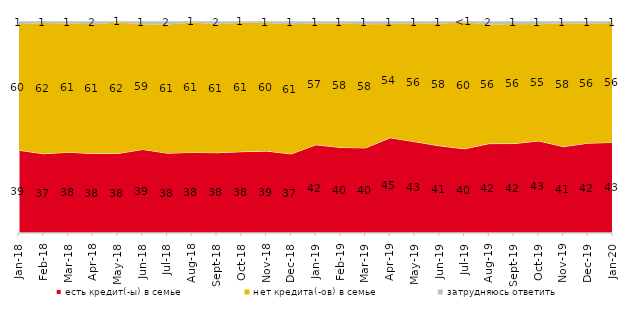
| Category | есть кредит(-ы) в семье | нет кредита(-ов) в семье | затрудняюсь ответить |
|---|---|---|---|
| 2018-01-01 | 39.05 | 59.5 | 1.45 |
| 2018-02-01 | 37.4 | 61.8 | 0.8 |
| 2018-03-01 | 38.15 | 60.8 | 1.05 |
| 2018-04-01 | 37.5 | 61 | 1.5 |
| 2018-05-01 | 37.55 | 61.8 | 0.65 |
| 2018-06-01 | 39.45 | 59.15 | 1.35 |
| 2018-07-01 | 37.7 | 60.7 | 1.6 |
| 2018-08-01 | 38.05 | 61.3 | 0.65 |
| 2018-09-01 | 37.9 | 60.6 | 1.5 |
| 2018-10-01 | 38.4 | 60.85 | 0.75 |
| 2018-11-01 | 38.673 | 60.479 | 0.848 |
| 2018-12-01 | 37.35 | 61.2 | 1.45 |
| 2019-01-01 | 41.65 | 57.3 | 1.05 |
| 2019-02-01 | 40.4 | 58.45 | 1.15 |
| 2019-03-01 | 40.179 | 58.379 | 1.442 |
| 2019-04-01 | 44.95 | 53.762 | 1.287 |
| 2019-05-01 | 43.091 | 55.968 | 0.941 |
| 2019-06-01 | 41.147 | 57.656 | 1.197 |
| 2019-07-01 | 39.752 | 59.752 | 0.495 |
| 2019-08-01 | 42.208 | 56.144 | 1.648 |
| 2019-09-01 | 42.228 | 56.485 | 1.287 |
| 2019-10-01 | 43.465 | 55.099 | 1.436 |
| 2019-11-01 | 40.792 | 58.218 | 0.99 |
| 2019-12-01 | 42.426 | 56.386 | 1.188 |
| 2020-01-01 | 42.772 | 56.337 | 0.891 |